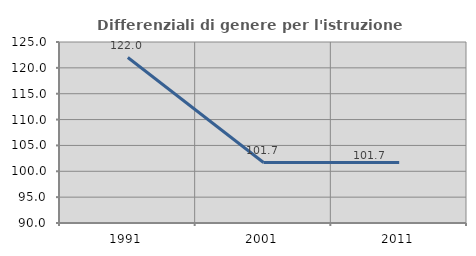
| Category | Differenziali di genere per l'istruzione superiore |
|---|---|
| 1991.0 | 121.995 |
| 2001.0 | 101.694 |
| 2011.0 | 101.68 |